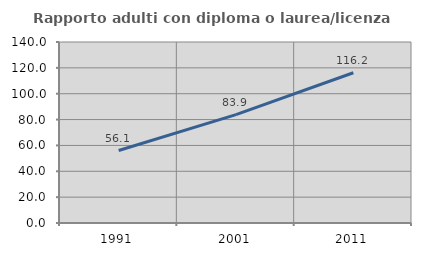
| Category | Rapporto adulti con diploma o laurea/licenza media  |
|---|---|
| 1991.0 | 56.077 |
| 2001.0 | 83.856 |
| 2011.0 | 116.216 |